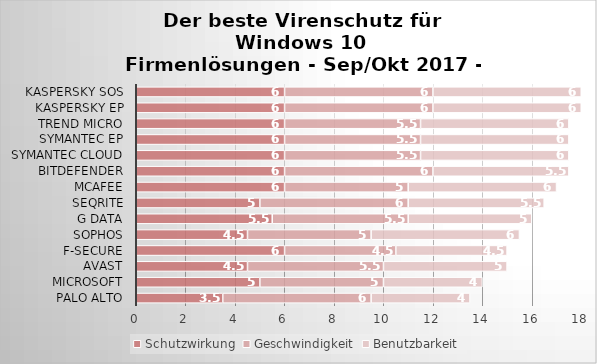
| Category | Schutzwirkung | Geschwindigkeit | Benutzbarkeit |
|---|---|---|---|
| Palo Alto | 3.5 | 6 | 4 |
| Microsoft | 5 | 5 | 4 |
| Avast | 4.5 | 5.5 | 5 |
| F-Secure | 6 | 4.5 | 4.5 |
| Sophos | 4.5 | 5 | 6 |
| G Data | 5.5 | 5.5 | 5 |
| Seqrite | 5 | 6 | 5.5 |
| McAfee | 6 | 5 | 6 |
| Bitdefender | 6 | 6 | 5.5 |
| Symantec Cloud | 6 | 5.5 | 6 |
| Symantec EP | 6 | 5.5 | 6 |
| Trend Micro | 6 | 5.5 | 6 |
| Kaspersky EP | 6 | 6 | 6 |
| Kaspersky SOS | 6 | 6 | 6 |